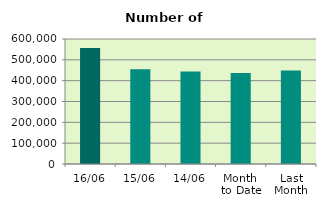
| Category | Series 0 |
|---|---|
| 16/06 | 556952 |
| 15/06 | 454854 |
| 14/06 | 444342 |
| Month 
to Date | 436572 |
| Last
Month | 449234.545 |